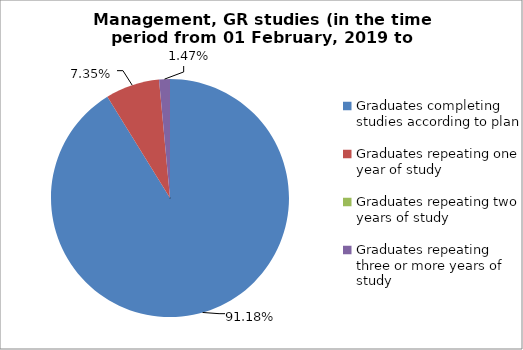
| Category | Series 0 |
|---|---|
| Graduates completing studies according to plan | 91.176 |
| Graduates repeating one year of study | 7.353 |
| Graduates repeating two years of study | 0 |
| Graduates repeating three or more years of study | 1.471 |